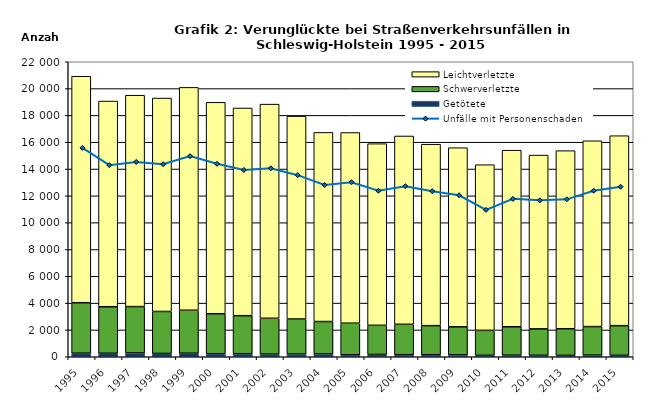
| Category | Getötete | Schwerverletzte | Leichtverletzte |
|---|---|---|---|
| 1995.0 | 268 | 3762 | 16890 |
| 1996.0 | 260 | 3469 | 15340 |
| 1997.0 | 282 | 3459 | 15764 |
| 1998.0 | 245 | 3132 | 15915 |
| 1999.0 | 264 | 3205 | 16619 |
| 2000.0 | 223 | 2985 | 15767 |
| 2001.0 | 226 | 2837 | 15488 |
| 2002.0 | 199 | 2670 | 15971 |
| 2003.0 | 204 | 2611 | 15128 |
| 2004.0 | 212 | 2415 | 14104 |
| 2005.0 | 148 | 2355 | 14219 |
| 2006.0 | 172 | 2173 | 13546 |
| 2007.0 | 156 | 2265 | 14043 |
| 2008.0 | 149 | 2169 | 13535 |
| 2009.0 | 140 | 2092 | 13360 |
| 2010.0 | 108 | 1862 | 12352 |
| 2011.0 | 120 | 2116 | 13169 |
| 2012.0 | 110 | 1970 | 12961 |
| 2013.0 | 103 | 1987 | 13280 |
| 2014.0 | 121 | 2128 | 13858 |
| 2015.0 | 107 | 2211 | 14167 |